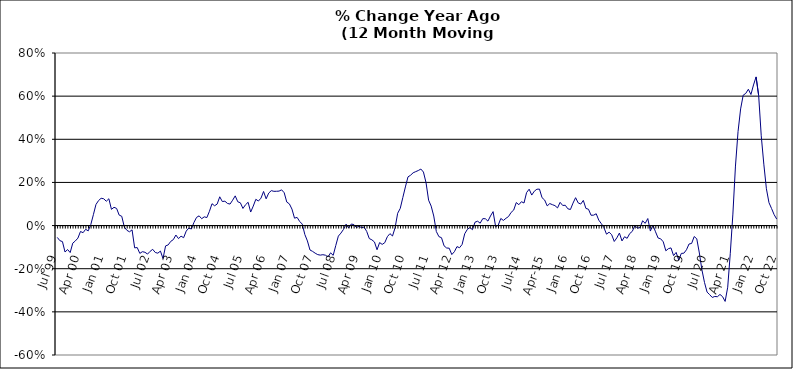
| Category | Series 0 |
|---|---|
| Jul 99 | -0.055 |
| Aug 99 | -0.07 |
| Sep 99 | -0.074 |
| Oct 99 | -0.123 |
| Nov 99 | -0.111 |
| Dec 99 | -0.125 |
| Jan 00 | -0.082 |
| Feb 00 | -0.071 |
| Mar 00 | -0.058 |
| Apr 00 | -0.027 |
| May 00 | -0.033 |
| Jun 00 | -0.017 |
| Jul 00 | -0.025 |
| Aug 00 | 0.005 |
| Sep 00 | 0.05 |
| Oct 00 | 0.098 |
| Nov 00 | 0.116 |
| Dec 00 | 0.127 |
| Jan 01 | 0.124 |
| Feb 01 | 0.113 |
| Mar 01 | 0.124 |
| Apr 01 | 0.075 |
| May 01 | 0.085 |
| Jun 01 | 0.08 |
| Jul 01 | 0.048 |
| Aug 01 | 0.043 |
| Sep 01 | -0.007 |
| Oct 01 | -0.022 |
| Nov 01 | -0.029 |
| Dec 01 | -0.02 |
| Jan 02 | -0.103 |
| Feb 02 | -0.102 |
| Mar 02 | -0.129 |
| Apr 02 | -0.121 |
| May 02 | -0.124 |
| Jun 02 | -0.132 |
| Jul 02 | -0.119 |
| Aug 02 | -0.11 |
| Sep 02 | -0.125 |
| Oct 02 | -0.128 |
| Nov 02 | -0.118 |
| Dec 02 | -0.153 |
| Jan 03 | -0.094 |
| Feb 03 | -0.09 |
| Mar 03 | -0.073 |
| Apr 03 | -0.065 |
| May 03 | -0.044 |
| Jun 03 | -0.06 |
| Jul 03 | -0.049 |
| Aug 03 | -0.056 |
| Sep 03 | -0.026 |
| Oct 03 | -0.012 |
| Nov 03 | -0.016 |
| Dec 03 | 0.014 |
| Jan 04 | 0.038 |
| Feb 04 | 0.045 |
| Mar 04 | 0.032 |
| Apr 04 | 0.041 |
| May 04 | 0.037 |
| Jun 04 | 0.066 |
| Jul 04 | 0.101 |
| Aug 04 | 0.092 |
| Sep 04 | 0.1 |
| Oct 04 | 0.133 |
| Nov 04 | 0.111 |
| Dec 04 | 0.113 |
| Jan 05 | 0.103 |
| Feb 05 | 0.1 |
| Mar 05 | 0.118 |
| Apr 05 | 0.138 |
| May 05 | 0.11 |
| Jun 05 | 0.106 |
| Jul 05 | 0.079 |
| Aug 05 | 0.097 |
| Sep 05 | 0.108 |
| Oct 05 | 0.063 |
| Nov 05 | 0.09 |
| Dec 05 | 0.122 |
| Jan 06 | 0.114 |
| Feb 06 | 0.127 |
| Mar 06 | 0.158 |
| Apr 06 | 0.124 |
| May 06 | 0.151 |
| Jun 06 | 0.162 |
| Jul 06 | 0.159 |
| Aug 06 | 0.159 |
| Sep 06 | 0.16 |
| Oct 06 | 0.166 |
| Nov 06 | 0.152 |
| Dec 06 | 0.109 |
| Jan 07 | 0.101 |
| Feb 07 | 0.076 |
| Mar 07 | 0.034 |
| Apr 07 | 0.038 |
| May 07 | 0.019 |
| Jun 07 | 0.007 |
| Jul 07 | -0.041 |
| Aug 07 | -0.071 |
| Sep 07 | -0.113 |
| Oct 07 | -0.12 |
| Nov 07 | -0.128 |
| Dec 07 | -0.135 |
| Jan 08 | -0.137 |
| Feb 08 | -0.135 |
| Mar 08 | -0.137 |
| Apr 08 | -0.145 |
| May 08 | -0.126 |
| Jun 08 | -0.138 |
| Jul 08 | -0.093 |
| Aug 08 | -0.049 |
| Sep-08 | -0.035 |
| Oct 08 | -0.018 |
| Nov 08 | 0.007 |
| Dec 08 | -0.011 |
| Jan 09 | 0.007 |
| Feb 09 | 0.005 |
| Mar 09 | -0.009 |
| Apr 09 | -0.003 |
| May 09 | -0.01 |
| Jun 09 | -0.007 |
| Jul 09 | -0.027 |
| Aug 09 | -0.06 |
| Sep 09 | -0.066 |
| Oct 09 | -0.076 |
| Nov 09 | -0.112 |
| Dec 09 | -0.079 |
| Jan 10 | -0.087 |
| Feb 10 | -0.079 |
| Mar 10 | -0.052 |
| Apr 10 | -0.037 |
| May 10 | -0.048 |
| Jun 10 | -0.01 |
| Jul 10 | 0.057 |
| Aug 10 | 0.08 |
| Sep 10 | 0.13 |
| Oct 10 | 0.179 |
| Nov 10 | 0.226 |
| Dec 10 | 0.233 |
| Jan 11 | 0.245 |
| Feb 11 | 0.25 |
| Mar 11 | 0.255 |
| Apr 11 | 0.262 |
| May 11 | 0.248 |
| Jun 11 | 0.199 |
| Jul 11 | 0.118 |
| Aug 11 | 0.09 |
| Sep 11 | 0.044 |
| Oct 11 | -0.028 |
| Nov 11 | -0.051 |
| Dec 11 | -0.056 |
| Jan 12 | -0.094 |
| Feb 12 | -0.104 |
| Mar 12 | -0.105 |
| Apr 12 | -0.134 |
| May 12 | -0.121 |
| Jun 12 | -0.098 |
| Jul 12 | -0.103 |
| Aug 12 | -0.087 |
| Sep 12 | -0.038 |
| Oct 12 | -0.018 |
| Nov 12 | -0.009 |
| Dec 12 | -0.019 |
| Jan 13 | 0.016 |
| Feb-13 | 0.02 |
| Mar-13 | 0.011 |
| Apr 13 | 0.032 |
| May 13 | 0.032 |
| Jun-13 | 0.021 |
| Jul 13 | 0.045 |
| Aug 13 | 0.065 |
| Sep 13 | -0.005 |
| Oct 13 | 0.002 |
| Nov 13 | 0.033 |
| Dec 13 | 0.024 |
| Jan 14 | 0.034 |
| Feb-14 | 0.042 |
| Mar 14 | 0.061 |
| Apr 14 | 0.072 |
| May 14 | 0.107 |
| Jun 14 | 0.097 |
| Jul-14 | 0.111 |
| Aug-14 | 0.105 |
| Sep 14 | 0.153 |
| Oct 14 | 0.169 |
| Nov 14 | 0.141 |
| Dec 14 | 0.159 |
| Jan 15 | 0.169 |
| Feb 15 | 0.169 |
| Mar 15 | 0.129 |
| Apr-15 | 0.118 |
| May 15 | 0.091 |
| Jun-15 | 0.102 |
| Jul 15 | 0.097 |
| Aug 15 | 0.092 |
| Sep 15 | 0.082 |
| Oct 15 | 0.108 |
| Nov 15 | 0.093 |
| Dec 15 | 0.094 |
| Jan 16 | 0.078 |
| Feb 16 | 0.075 |
| Mar 16 | 0.104 |
| Apr 16 | 0.129 |
| May 16 | 0.105 |
| Jun 16 | 0.1 |
| Jul 16 | 0.117 |
| Aug 16 | 0.08 |
| Sep 16 | 0.076 |
| Oct 16 | 0.048 |
| Nov 16 | 0.048 |
| Dec 16 | 0.055 |
| Jan 17 | 0.025 |
| Feb 17 | 0.009 |
| Mar 17 | -0.01 |
| Apr 17 | -0.04 |
| May 17 | -0.031 |
| Jun 17 | -0.042 |
| Jul 17 | -0.074 |
| Aug 17 | -0.057 |
| Sep 17 | -0.035 |
| Oct 17 | -0.071 |
| Nov 17 | -0.052 |
| Dec 17 | -0.059 |
| Jan 18 | -0.037 |
| Feb 18 | -0.027 |
| Mar 18 | 0 |
| Apr 18 | -0.012 |
| May 18 | -0.009 |
| Jun 18 | 0.022 |
| Jul 18 | 0.01 |
| Aug 18 | 0.033 |
| Sep 18 | -0.025 |
| Oct 18 | 0.002 |
| Nov 18 | -0.029 |
| Dec 18 | -0.058 |
| Jan 19 | -0.061 |
| Feb 19 | -0.075 |
| Mar 19 | -0.117 |
| Apr 19 | -0.107 |
| May 19 | -0.104 |
| Jun 19 | -0.139 |
| Jul 19 | -0.124 |
| Aug 19 | -0.16 |
| Sep 19 | -0.129 |
| Oct 19 | -0.128 |
| Nov 19 | -0.112 |
| Dec 19 | -0.085 |
| Jan 20 | -0.083 |
| Feb 20 | -0.051 |
| Mar 20 | -0.061 |
| Apr 20 | -0.127 |
| May 20 | -0.206 |
| Jun 20 | -0.264 |
| Jul 20 | -0.308 |
| Aug 20 | -0.32 |
| Sep 20 | -0.333 |
| Oct 20 | -0.329 |
| Nov 20 | -0.33 |
| Dec 20 | -0.319 |
| Jan 21 | -0.329 |
| Feb 21 | -0.352 |
| Mar 21 | -0.286 |
| Apr 21 | -0.129 |
| May 21 | 0.053 |
| Jun 21 | 0.276 |
| Jul 21 | 0.435 |
| Aug 21 | 0.541 |
| Sep 21 | 0.604 |
| Oct 21 | 0.613 |
| Nov 21 | 0.632 |
| Dec 21 | 0.608 |
| Jan 22 | 0.652 |
| Feb 22 | 0.689 |
| Mar 22 | 0.603 |
| Apr 22 | 0.416 |
| May 22 | 0.285 |
| Jun 22 | 0.171 |
| Jul 22 | 0.106 |
| Aug 22 | 0.079 |
| Sep 22 | 0.051 |
| Oct 22 | 0.03 |